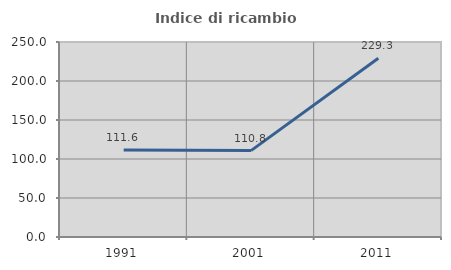
| Category | Indice di ricambio occupazionale  |
|---|---|
| 1991.0 | 111.594 |
| 2001.0 | 110.769 |
| 2011.0 | 229.268 |